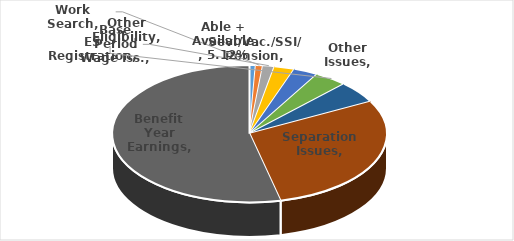
| Category | Series 0 |
|---|---|
| Sev./Vac./SSI/ Pension | 0.007 |
| Work Search | 0.008 |
| ES Registration | 0.014 |
| Base Period Wage Iss. | 0.024 |
| Other Issues | 0.029 |
| Other Eligibility | 0.039 |
| Able + Available | 0.051 |
| Separation Issues | 0.292 |
| Benefit Year Earnings | 0.536 |